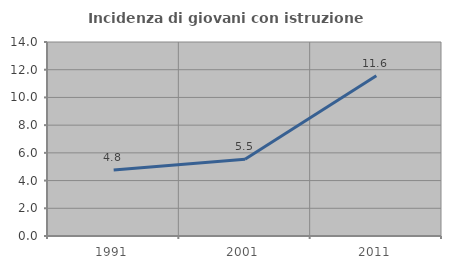
| Category | Incidenza di giovani con istruzione universitaria |
|---|---|
| 1991.0 | 4.762 |
| 2001.0 | 5.532 |
| 2011.0 | 11.57 |